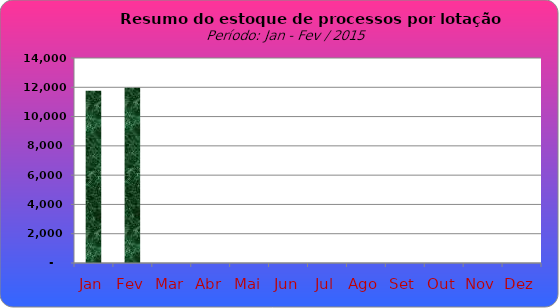
| Category | Series 0 |
|---|---|
| Jan | 11768 |
| Fev | 11973 |
| Mar | 0 |
| Abr | 0 |
| Mai | 0 |
| Jun | 0 |
| Jul | 0 |
| Ago | 0 |
| Set | 0 |
| Out | 0 |
| Nov | 0 |
| Dez | 0 |